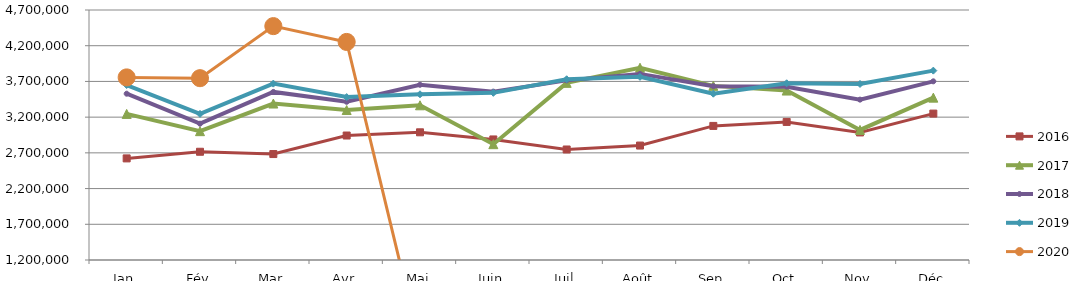
| Category | 2015 | 2016 | 2017 | 2018 | 2019 | 2020 |
|---|---|---|---|---|---|---|
| Jan |  | 2622357.223 | 3245197.198 | 3528241.229 | 3649683.28 | 3756283.089 |
| Fév |  | 2715310.977 | 3003729.629 | 3108555.552 | 3245578.859 | 3745626.569 |
| Mar |  | 2683334.081 | 3390554.233 | 3553184.371 | 3669368.201 | 4474226.706 |
| Avr |  | 2942696.513 | 3299613.683 | 3414889.226 | 3480737.518 | 4252877.011 |
| Mai |  | 2987632.117 | 3365963.719 | 3653293.789 | 3520173.393 | 0 |
| Juin |  | 2887718.315 | 2821580.781 | 3557351.211 | 3540194.304 | 0 |
| Juil |  | 2747166.698 | 3679918.411 | 3714873.235 | 3730287.221 | 0 |
| Août |  | 2802126.518 | 3891741.582 | 3805404.89 | 3764065.715 | 0 |
| Sep |  | 3077154.853 | 3637785.062 | 3633589.924 | 3528193.213 | 0 |
| Oct |  | 3132986.26 | 3572314.256 | 3626810.501 | 3674095.651 | 0 |
| Nov |  | 2985784.845 | 3021243.296 | 3445044.438 | 3664597.161 | 0 |
| Déc |  | 3249878.984 | 3473156.754 | 3701418.855 | 3851208.606 | 0 |